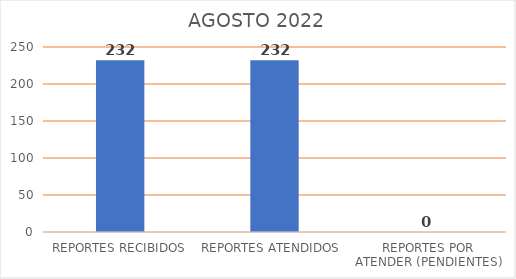
| Category | Series 0 |
|---|---|
| REPORTES RECIBIDOS | 232 |
| REPORTES ATENDIDOS  | 232 |
| REPORTES POR ATENDER (PENDIENTES) | 0 |